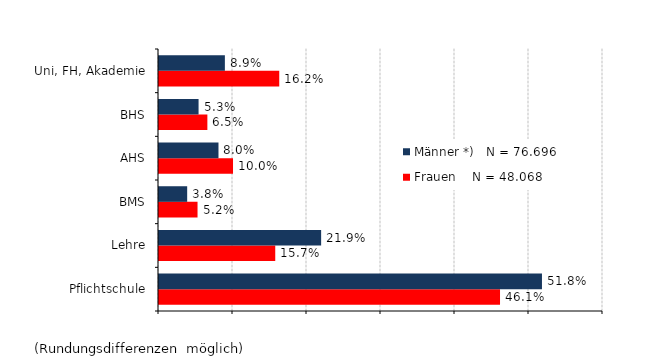
| Category | Frauen    N = 48.068 | Männer *)   N = 76.696 |
|---|---|---|
| Pflichtschule | 0.461 | 0.518 |
| Lehre | 0.157 | 0.219 |
| BMS | 0.052 | 0.038 |
| AHS | 0.1 | 0.08 |
| BHS | 0.065 | 0.053 |
| Uni, FH, Akademie | 0.162 | 0.089 |